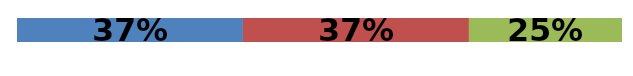
| Category | Series 0 | Series 1 | Series 2 |
|---|---|---|---|
| 0 | 0.373 | 0.373 | 0.253 |